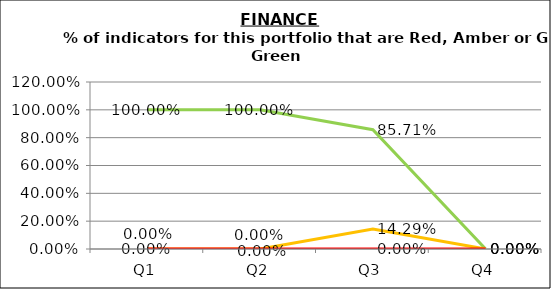
| Category | Green | Amber | Red |
|---|---|---|---|
| Q1 | 1 | 0 | 0 |
| Q2 | 1 | 0 | 0 |
| Q3 | 0.857 | 0.143 | 0 |
| Q4 | 0 | 0 | 0 |